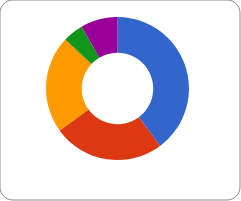
| Category | Series 0 |
|---|---|
| Transporte | 0.398 |
| Hotel | 0.252 |
| Comida | 0.22 |
| Entretenimento | 0.046 |
| Outros | 0.084 |